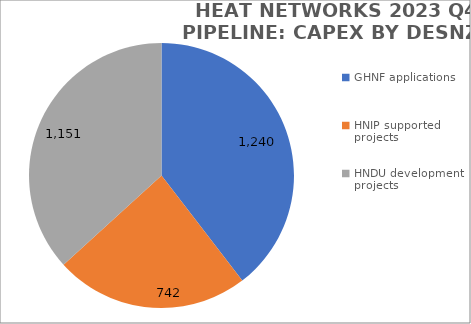
| Category | Capex |
|---|---|
| GHNF applications | 1239.514 |
| HNIP supported projects | 741.688 |
| HNDU development projects | 1151.213 |